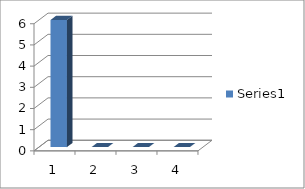
| Category | Series 0 |
|---|---|
| 0 | 6 |
| 1 | 0 |
| 2 | 0 |
| 3 | 0 |